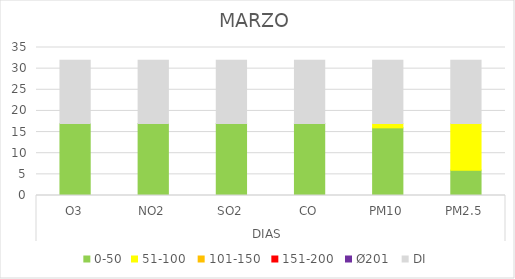
| Category | 0-50 | 51-100  | 101-150  | 151-200  | Ø201  | DI |
|---|---|---|---|---|---|---|
| 0 | 17 | 0 | 0 | 0 | 0 | 15 |
| 1 | 17 | 0 | 0 | 0 | 0 | 15 |
| 2 | 17 | 0 | 0 | 0 | 0 | 15 |
| 3 | 17 | 0 | 0 | 0 | 0 | 15 |
| 4 | 16 | 1 | 0 | 0 | 0 | 15 |
| 5 | 6 | 11 | 0 | 0 | 0 | 15 |